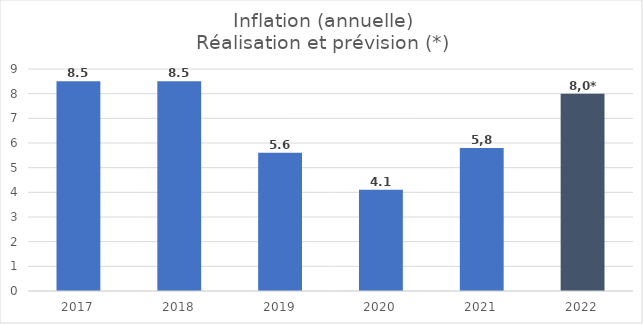
| Category |  Inflation  |
|---|---|
| 2017.0 | 8.5 |
| 2018.0 | 8.5 |
| 2019.0 | 5.6 |
| 2020.0 | 4.1 |
| 2021.0 | 5.8 |
| 2022.0 | 8 |